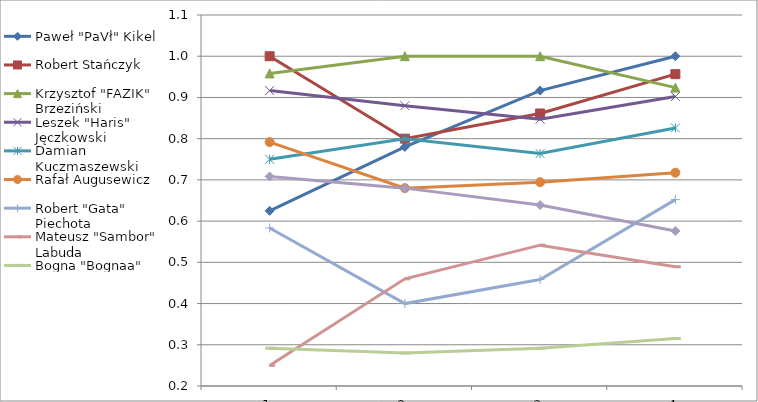
| Category | Paweł "PaVł" Kikel | Robert Stańczyk | Krzysztof "FAZIK" Brzeziński | Leszek "Haris" Jęczkowski | Damian Kuczmaszewski | Rafał Augusewicz | Robert "Gata" Piechota | Mateusz "Sambor" Labuda | Bogna "Bognaa" Deryło | Dorota Janiszewska |
|---|---|---|---|---|---|---|---|---|---|---|
| 0 | 0.625 | 1 | 0.958 | 0.917 | 0.75 | 0.792 | 0.583 | 0.25 | 0.292 | 0.708 |
| 1 | 0.78 | 0.8 | 1 | 0.88 | 0.8 | 0.68 | 0.4 | 0.46 | 0.28 | 0.68 |
| 2 | 0.917 | 0.861 | 1 | 0.847 | 0.764 | 0.694 | 0.458 | 0.542 | 0.292 | 0.639 |
| 3 | 1 | 0.957 | 0.924 | 0.902 | 0.826 | 0.717 | 0.652 | 0.489 | 0.315 | 0.576 |